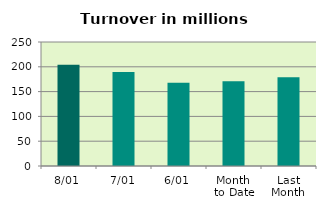
| Category | Series 0 |
|---|---|
| 8/01 | 204.323 |
| 7/01 | 189.766 |
| 6/01 | 167.949 |
| Month 
to Date | 170.709 |
| Last
Month | 179.047 |